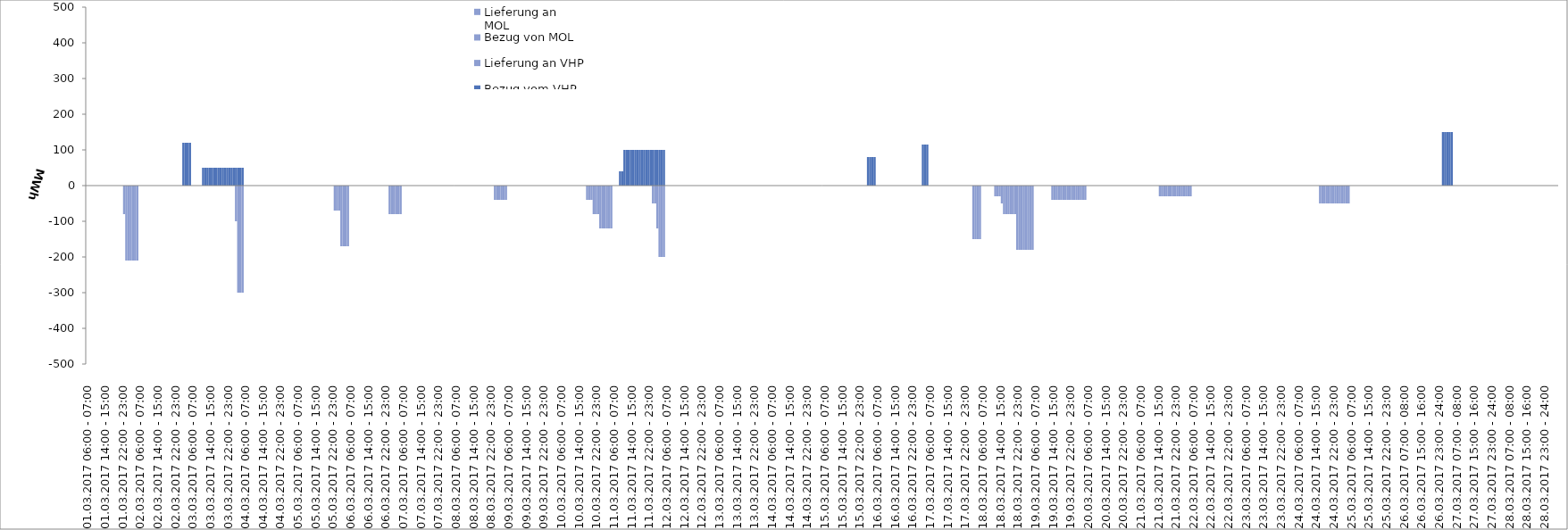
| Category | Bezug vom VHP | Lieferung an VHP | Bezug von MOL | Lieferung an MOL |
|---|---|---|---|---|
| 01.03.2017 06:00 - 07:00 | 0 | 0 | 0 | 0 |
| 01.03.2017 07:00 - 08:00 | 0 | 0 | 0 | 0 |
| 01.03.2017 08:00 - 09:00 | 0 | 0 | 0 | 0 |
| 01.03.2017 09:00 - 10:00 | 0 | 0 | 0 | 0 |
| 01.03.2017 10:00 - 11:00 | 0 | 0 | 0 | 0 |
| 01.03.2017 11:00 - 12:00 | 0 | 0 | 0 | 0 |
| 01.03.2017 12:00 - 13:00 | 0 | 0 | 0 | 0 |
| 01.03.2017 13:00 - 14:00 | 0 | 0 | 0 | 0 |
| 01.03.2017 14:00 - 15:00 | 0 | 0 | 0 | 0 |
| 01.03.2017 15:00 - 16:00 | 0 | 0 | 0 | 0 |
| 01.03.2017 16:00 - 17:00 | 0 | 0 | 0 | 0 |
| 01.03.2017 17:00 - 18:00 | 0 | 0 | 0 | 0 |
| 01.03.2017 18:00 - 19:00 | 0 | 0 | 0 | 0 |
| 01.03.2017 19:00 - 20:00 | 0 | 0 | 0 | 0 |
| 01.03.2017 20:00 - 21:00 | 0 | 0 | 0 | 0 |
| 01.03.2017 21:00 - 22:00 | 0 | 0 | 0 | 0 |
| 01.03.2017 22:00 - 23:00 | 0 | 0 | 0 | 0 |
| 01.03.2017 23:00 - 24:00 | 0 | -80 | 0 | 0 |
| 02.03.2017 00:00 - 01:00 | 0 | -210 | 0 | 0 |
| 02.03.2017 01:00 - 02:00 | 0 | -210 | 0 | 0 |
| 02.03.2017 02:00 - 03:00 | 0 | -210 | 0 | 0 |
| 02.03.2017 03:00 - 04:00 | 0 | -210 | 0 | 0 |
| 02.03.2017 04:00 - 05:00 | 0 | -210 | 0 | 0 |
| 02.03.2017 05:00 - 06:00 | 0 | -210 | 0 | 0 |
| 02.03.2017 06:00 - 07:00 | 0 | 0 | 0 | 0 |
| 02.03.2017 07:00 - 08:00 | 0 | 0 | 0 | 0 |
| 02.03.2017 08:00 - 09:00 | 0 | 0 | 0 | 0 |
| 02.03.2017 09:00 - 10:00 | 0 | 0 | 0 | 0 |
| 02.03.2017 10:00 - 11:00 | 0 | 0 | 0 | 0 |
| 02.03.2017 11:00 - 12:00 | 0 | 0 | 0 | 0 |
| 02.03.2017 12:00 - 13:00 | 0 | 0 | 0 | 0 |
| 02.03.2017 13:00 - 14:00 | 0 | 0 | 0 | 0 |
| 02.03.2017 14:00 - 15:00 | 0 | 0 | 0 | 0 |
| 02.03.2017 15:00 - 16:00 | 0 | 0 | 0 | 0 |
| 02.03.2017 16:00 - 17:00 | 0 | 0 | 0 | 0 |
| 02.03.2017 17:00 - 18:00 | 0 | 0 | 0 | 0 |
| 02.03.2017 18:00 - 19:00 | 0 | 0 | 0 | 0 |
| 02.03.2017 19:00 - 20:00 | 0 | 0 | 0 | 0 |
| 02.03.2017 20:00 - 21:00 | 0 | 0 | 0 | 0 |
| 02.03.2017 21:00 - 22:00 | 0 | 0 | 0 | 0 |
| 02.03.2017 22:00 - 23:00 | 0 | 0 | 0 | 0 |
| 02.03.2017 23:00 - 24:00 | 0 | 0 | 0 | 0 |
| 03.03.2017 00:00 - 01:00 | 0 | 0 | 0 | 0 |
| 03.03.2017 01:00 - 02:00 | 0 | 0 | 0 | 0 |
| 03.03.2017 02:00 - 03:00 | 120 | 0 | 0 | 0 |
| 03.03.2017 03:00 - 04:00 | 120 | 0 | 0 | 0 |
| 03.03.2017 04:00 - 05:00 | 120 | 0 | 0 | 0 |
| 03.03.2017 05:00 - 06:00 | 120 | 0 | 0 | 0 |
| 03.03.2017 06:00 - 07:00 | 0 | 0 | 0 | 0 |
| 03.03.2017 07:00 - 08:00 | 0 | 0 | 0 | 0 |
| 03.03.2017 08:00 - 09:00 | 0 | 0 | 0 | 0 |
| 03.03.2017 09:00 - 10:00 | 0 | 0 | 0 | 0 |
| 03.03.2017 10:00 - 11:00 | 0 | 0 | 0 | 0 |
| 03.03.2017 11:00 - 12:00 | 50 | 0 | 0 | 0 |
| 03.03.2017 12:00 - 13:00 | 50 | 0 | 0 | 0 |
| 03.03.2017 13:00 - 14:00 | 50 | 0 | 0 | 0 |
| 03.03.2017 14:00 - 15:00 | 50 | 0 | 0 | 0 |
| 03.03.2017 15:00 - 16:00 | 50 | 0 | 0 | 0 |
| 03.03.2017 16:00 - 17:00 | 50 | 0 | 0 | 0 |
| 03.03.2017 17:00 - 18:00 | 50 | 0 | 0 | 0 |
| 03.03.2017 18:00 - 19:00 | 50 | 0 | 0 | 0 |
| 03.03.2017 19:00 - 20:00 | 50 | 0 | 0 | 0 |
| 03.03.2017 20:00 - 21:00 | 50 | 0 | 0 | 0 |
| 03.03.2017 21:00 - 22:00 | 50 | 0 | 0 | 0 |
| 03.03.2017 22:00 - 23:00 | 50 | 0 | 0 | 0 |
| 03.03.2017 23:00 - 24:00 | 50 | 0 | 0 | 0 |
| 04.03.2017 00:00 - 01:00 | 50 | 0 | 0 | 0 |
| 04.03.2017 01:00 - 02:00 | 50 | 0 | 0 | 0 |
| 04.03.2017 02:00 - 03:00 | 50 | -100 | 0 | 0 |
| 04.03.2017 03:00 - 04:00 | 50 | -300 | 0 | 0 |
| 04.03.2017 04:00 - 05:00 | 50 | -300 | 0 | 0 |
| 04.03.2017 05:00 - 06:00 | 50 | -300 | 0 | 0 |
| 04.03.2017 06:00 - 07:00 | 0 | 0 | 0 | 0 |
| 04.03.2017 07:00 - 08:00 | 0 | 0 | 0 | 0 |
| 04.03.2017 08:00 - 09:00 | 0 | 0 | 0 | 0 |
| 04.03.2017 09:00 - 10:00 | 0 | 0 | 0 | 0 |
| 04.03.2017 10:00 - 11:00 | 0 | 0 | 0 | 0 |
| 04.03.2017 11:00 - 12:00 | 0 | 0 | 0 | 0 |
| 04.03.2017 12:00 - 13:00 | 0 | 0 | 0 | 0 |
| 04.03.2017 13:00 - 14:00 | 0 | 0 | 0 | 0 |
| 04.03.2017 14:00 - 15:00 | 0 | 0 | 0 | 0 |
| 04.03.2017 15:00 - 16:00 | 0 | 0 | 0 | 0 |
| 04.03.2017 16:00 - 17:00 | 0 | 0 | 0 | 0 |
| 04.03.2017 17:00 - 18:00 | 0 | 0 | 0 | 0 |
| 04.03.2017 18:00 - 19:00 | 0 | 0 | 0 | 0 |
| 04.03.2017 19:00 - 20:00 | 0 | 0 | 0 | 0 |
| 04.03.2017 20:00 - 21:00 | 0 | 0 | 0 | 0 |
| 04.03.2017 21:00 - 22:00 | 0 | 0 | 0 | 0 |
| 04.03.2017 22:00 - 23:00 | 0 | 0 | 0 | 0 |
| 04.03.2017 23:00 - 24:00 | 0 | 0 | 0 | 0 |
| 05.03.2017 00:00 - 01:00 | 0 | 0 | 0 | 0 |
| 05.03.2017 01:00 - 02:00 | 0 | 0 | 0 | 0 |
| 05.03.2017 02:00 - 03:00 | 0 | 0 | 0 | 0 |
| 05.03.2017 03:00 - 04:00 | 0 | 0 | 0 | 0 |
| 05.03.2017 04:00 - 05:00 | 0 | 0 | 0 | 0 |
| 05.03.2017 05:00 - 06:00 | 0 | 0 | 0 | 0 |
| 05.03.2017 06:00 - 07:00 | 0 | 0 | 0 | 0 |
| 05.03.2017 07:00 - 08:00 | 0 | 0 | 0 | 0 |
| 05.03.2017 08:00 - 09:00 | 0 | 0 | 0 | 0 |
| 05.03.2017 09:00 - 10:00 | 0 | 0 | 0 | 0 |
| 05.03.2017 10:00 - 11:00 | 0 | 0 | 0 | 0 |
| 05.03.2017 11:00 - 12:00 | 0 | 0 | 0 | 0 |
| 05.03.2017 12:00 - 13:00 | 0 | 0 | 0 | 0 |
| 05.03.2017 13:00 - 14:00 | 0 | 0 | 0 | 0 |
| 05.03.2017 14:00 - 15:00 | 0 | 0 | 0 | 0 |
| 05.03.2017 15:00 - 16:00 | 0 | 0 | 0 | 0 |
| 05.03.2017 16:00 - 17:00 | 0 | 0 | 0 | 0 |
| 05.03.2017 17:00 - 18:00 | 0 | 0 | 0 | 0 |
| 05.03.2017 18:00 - 19:00 | 0 | 0 | 0 | 0 |
| 05.03.2017 19:00 - 20:00 | 0 | 0 | 0 | 0 |
| 05.03.2017 20:00 - 21:00 | 0 | 0 | 0 | 0 |
| 05.03.2017 21:00 - 22:00 | 0 | 0 | 0 | 0 |
| 05.03.2017 22:00 - 23:00 | 0 | 0 | 0 | 0 |
| 05.03.2017 23:00 - 24:00 | 0 | -70 | 0 | 0 |
| 06.03.2017 00:00 - 01:00 | 0 | -70 | 0 | 0 |
| 06.03.2017 01:00 - 02:00 | 0 | -70 | 0 | 0 |
| 06.03.2017 02:00 - 03:00 | 0 | -170 | 0 | 0 |
| 06.03.2017 03:00 - 04:00 | 0 | -170 | 0 | 0 |
| 06.03.2017 04:00 - 05:00 | 0 | -170 | 0 | 0 |
| 06.03.2017 05:00 - 06:00 | 0 | -170 | 0 | 0 |
| 06.03.2017 06:00 - 07:00 | 0 | 0 | 0 | 0 |
| 06.03.2017 07:00 - 08:00 | 0 | 0 | 0 | 0 |
| 06.03.2017 08:00 - 09:00 | 0 | 0 | 0 | 0 |
| 06.03.2017 09:00 - 10:00 | 0 | 0 | 0 | 0 |
| 06.03.2017 10:00 - 11:00 | 0 | 0 | 0 | 0 |
| 06.03.2017 11:00 - 12:00 | 0 | 0 | 0 | 0 |
| 06.03.2017 12:00 - 13:00 | 0 | 0 | 0 | 0 |
| 06.03.2017 13:00 - 14:00 | 0 | 0 | 0 | 0 |
| 06.03.2017 14:00 - 15:00 | 0 | 0 | 0 | 0 |
| 06.03.2017 15:00 - 16:00 | 0 | 0 | 0 | 0 |
| 06.03.2017 16:00 - 17:00 | 0 | 0 | 0 | 0 |
| 06.03.2017 17:00 - 18:00 | 0 | 0 | 0 | 0 |
| 06.03.2017 18:00 - 19:00 | 0 | 0 | 0 | 0 |
| 06.03.2017 19:00 - 20:00 | 0 | 0 | 0 | 0 |
| 06.03.2017 20:00 - 21:00 | 0 | 0 | 0 | 0 |
| 06.03.2017 21:00 - 22:00 | 0 | 0 | 0 | 0 |
| 06.03.2017 22:00 - 23:00 | 0 | 0 | 0 | 0 |
| 06.03.2017 23:00 - 24:00 | 0 | 0 | 0 | 0 |
| 07.03.2017 00:00 - 01:00 | 0 | -80 | 0 | 0 |
| 07.03.2017 01:00 - 02:00 | 0 | -80 | 0 | 0 |
| 07.03.2017 02:00 - 03:00 | 0 | -80 | 0 | 0 |
| 07.03.2017 03:00 - 04:00 | 0 | -80 | 0 | 0 |
| 07.03.2017 04:00 - 05:00 | 0 | -80 | 0 | 0 |
| 07.03.2017 05:00 - 06:00 | 0 | -80 | 0 | 0 |
| 07.03.2017 06:00 - 07:00 | 0 | 0 | 0 | 0 |
| 07.03.2017 07:00 - 08:00 | 0 | 0 | 0 | 0 |
| 07.03.2017 08:00 - 09:00 | 0 | 0 | 0 | 0 |
| 07.03.2017 09:00 - 10:00 | 0 | 0 | 0 | 0 |
| 07.03.2017 10:00 - 11:00 | 0 | 0 | 0 | 0 |
| 07.03.2017 11:00 - 12:00 | 0 | 0 | 0 | 0 |
| 07.03.2017 12:00 - 13:00 | 0 | 0 | 0 | 0 |
| 07.03.2017 13:00 - 14:00 | 0 | 0 | 0 | 0 |
| 07.03.2017 14:00 - 15:00 | 0 | 0 | 0 | 0 |
| 07.03.2017 15:00 - 16:00 | 0 | 0 | 0 | 0 |
| 07.03.2017 16:00 - 17:00 | 0 | 0 | 0 | 0 |
| 07.03.2017 17:00 - 18:00 | 0 | 0 | 0 | 0 |
| 07.03.2017 18:00 - 19:00 | 0 | 0 | 0 | 0 |
| 07.03.2017 19:00 - 20:00 | 0 | 0 | 0 | 0 |
| 07.03.2017 20:00 - 21:00 | 0 | 0 | 0 | 0 |
| 07.03.2017 21:00 - 22:00 | 0 | 0 | 0 | 0 |
| 07.03.2017 22:00 - 23:00 | 0 | 0 | 0 | 0 |
| 07.03.2017 23:00 - 24:00 | 0 | 0 | 0 | 0 |
| 08.03.2017 00:00 - 01:00 | 0 | 0 | 0 | 0 |
| 08.03.2017 01:00 - 02:00 | 0 | 0 | 0 | 0 |
| 08.03.2017 02:00 - 03:00 | 0 | 0 | 0 | 0 |
| 08.03.2017 03:00 - 04:00 | 0 | 0 | 0 | 0 |
| 08.03.2017 04:00 - 05:00 | 0 | 0 | 0 | 0 |
| 08.03.2017 05:00 - 06:00 | 0 | 0 | 0 | 0 |
| 08.03.2017 06:00 - 07:00 | 0 | 0 | 0 | 0 |
| 08.03.2017 07:00 - 08:00 | 0 | 0 | 0 | 0 |
| 08.03.2017 08:00 - 09:00 | 0 | 0 | 0 | 0 |
| 08.03.2017 09:00 - 10:00 | 0 | 0 | 0 | 0 |
| 08.03.2017 10:00 - 11:00 | 0 | 0 | 0 | 0 |
| 08.03.2017 11:00 - 12:00 | 0 | 0 | 0 | 0 |
| 08.03.2017 12:00 - 13:00 | 0 | 0 | 0 | 0 |
| 08.03.2017 13:00 - 14:00 | 0 | 0 | 0 | 0 |
| 08.03.2017 14:00 - 15:00 | 0 | 0 | 0 | 0 |
| 08.03.2017 15:00 - 16:00 | 0 | 0 | 0 | 0 |
| 08.03.2017 16:00 - 17:00 | 0 | 0 | 0 | 0 |
| 08.03.2017 17:00 - 18:00 | 0 | 0 | 0 | 0 |
| 08.03.2017 18:00 - 19:00 | 0 | 0 | 0 | 0 |
| 08.03.2017 19:00 - 20:00 | 0 | 0 | 0 | 0 |
| 08.03.2017 20:00 - 21:00 | 0 | 0 | 0 | 0 |
| 08.03.2017 21:00 - 22:00 | 0 | 0 | 0 | 0 |
| 08.03.2017 22:00 - 23:00 | 0 | 0 | 0 | 0 |
| 08.03.2017 23:00 - 24:00 | 0 | 0 | 0 | 0 |
| 09.03.2017 00:00 - 01:00 | 0 | -40 | 0 | 0 |
| 09.03.2017 01:00 - 02:00 | 0 | -40 | 0 | 0 |
| 09.03.2017 02:00 - 03:00 | 0 | -40 | 0 | 0 |
| 09.03.2017 03:00 - 04:00 | 0 | -40 | 0 | 0 |
| 09.03.2017 04:00 - 05:00 | 0 | -40 | 0 | 0 |
| 09.03.2017 05:00 - 06:00 | 0 | -40 | 0 | 0 |
| 09.03.2017 06:00 - 07:00 | 0 | 0 | 0 | 0 |
| 09.03.2017 07:00 - 08:00 | 0 | 0 | 0 | 0 |
| 09.03.2017 08:00 - 09:00 | 0 | 0 | 0 | 0 |
| 09.03.2017 09:00 - 10:00 | 0 | 0 | 0 | 0 |
| 09.03.2017 10:00 - 11:00 | 0 | 0 | 0 | 0 |
| 09.03.2017 11:00 - 12:00 | 0 | 0 | 0 | 0 |
| 09.03.2017 12:00 - 13:00 | 0 | 0 | 0 | 0 |
| 09.03.2017 13:00 - 14:00 | 0 | 0 | 0 | 0 |
| 09.03.2017 14:00 - 15:00 | 0 | 0 | 0 | 0 |
| 09.03.2017 15:00 - 16:00 | 0 | 0 | 0 | 0 |
| 09.03.2017 16:00 - 17:00 | 0 | 0 | 0 | 0 |
| 09.03.2017 17:00 - 18:00 | 0 | 0 | 0 | 0 |
| 09.03.2017 18:00 - 19:00 | 0 | 0 | 0 | 0 |
| 09.03.2017 19:00 - 20:00 | 0 | 0 | 0 | 0 |
| 09.03.2017 20:00 - 21:00 | 0 | 0 | 0 | 0 |
| 09.03.2017 21:00 - 22:00 | 0 | 0 | 0 | 0 |
| 09.03.2017 22:00 - 23:00 | 0 | 0 | 0 | 0 |
| 09.03.2017 23:00 - 24:00 | 0 | 0 | 0 | 0 |
| 10.03.2017 00:00 - 01:00 | 0 | 0 | 0 | 0 |
| 10.03.2017 01:00 - 02:00 | 0 | 0 | 0 | 0 |
| 10.03.2017 02:00 - 03:00 | 0 | 0 | 0 | 0 |
| 10.03.2017 03:00 - 04:00 | 0 | 0 | 0 | 0 |
| 10.03.2017 04:00 - 05:00 | 0 | 0 | 0 | 0 |
| 10.03.2017 05:00 - 06:00 | 0 | 0 | 0 | 0 |
| 10.03.2017 06:00 - 07:00 | 0 | 0 | 0 | 0 |
| 10.03.2017 07:00 - 08:00 | 0 | 0 | 0 | 0 |
| 10.03.2017 08:00 - 09:00 | 0 | 0 | 0 | 0 |
| 10.03.2017 09:00 - 10:00 | 0 | 0 | 0 | 0 |
| 10.03.2017 10:00 - 11:00 | 0 | 0 | 0 | 0 |
| 10.03.2017 11:00 - 12:00 | 0 | 0 | 0 | 0 |
| 10.03.2017 12:00 - 13:00 | 0 | 0 | 0 | 0 |
| 10.03.2017 13:00 - 14:00 | 0 | 0 | 0 | 0 |
| 10.03.2017 14:00 - 15:00 | 0 | 0 | 0 | 0 |
| 10.03.2017 15:00 - 16:00 | 0 | 0 | 0 | 0 |
| 10.03.2017 16:00 - 17:00 | 0 | 0 | 0 | 0 |
| 10.03.2017 17:00 - 18:00 | 0 | 0 | 0 | 0 |
| 10.03.2017 18:00 - 19:00 | 0 | -40 | 0 | 0 |
| 10.03.2017 19:00 - 20:00 | 0 | -40 | 0 | 0 |
| 10.03.2017 20:00 - 21:00 | 0 | -40 | 0 | 0 |
| 10.03.2017 21:00 - 22:00 | 0 | -80 | 0 | 0 |
| 10.03.2017 22:00 - 23:00 | 0 | -80 | 0 | 0 |
| 10.03.2017 23:00 - 24:00 | 0 | -80 | 0 | 0 |
| 11.03.2017 00:00 - 01:00 | 0 | -120 | 0 | 0 |
| 11.03.2017 01:00 - 02:00 | 0 | -120 | 0 | 0 |
| 11.03.2017 02:00 - 03:00 | 0 | -120 | 0 | 0 |
| 11.03.2017 03:00 - 04:00 | 0 | -120 | 0 | 0 |
| 11.03.2017 04:00 - 05:00 | 0 | -120 | 0 | 0 |
| 11.03.2017 05:00 - 06:00 | 0 | -120 | 0 | 0 |
| 11.03.2017 06:00 - 07:00 | 0 | 0 | 0 | 0 |
| 11.03.2017 07:00 - 08:00 | 0 | 0 | 0 | 0 |
| 11.03.2017 08:00 - 09:00 | 0 | 0 | 0 | 0 |
| 11.03.2017 09:00 - 10:00 | 40 | 0 | 0 | 0 |
| 11.03.2017 10:00 - 11:00 | 40 | 0 | 0 | 0 |
| 11.03.2017 11:00 - 12:00 | 100 | 0 | 0 | 0 |
| 11.03.2017 12:00 - 13:00 | 100 | 0 | 0 | 0 |
| 11.03.2017 13:00 - 14:00 | 100 | 0 | 0 | 0 |
| 11.03.2017 14:00 - 15:00 | 100 | 0 | 0 | 0 |
| 11.03.2017 15:00 - 16:00 | 100 | 0 | 0 | 0 |
| 11.03.2017 16:00 - 17:00 | 100 | 0 | 0 | 0 |
| 11.03.2017 17:00 - 18:00 | 100 | 0 | 0 | 0 |
| 11.03.2017 18:00 - 19:00 | 100 | 0 | 0 | 0 |
| 11.03.2017 19:00 - 20:00 | 100 | 0 | 0 | 0 |
| 11.03.2017 20:00 - 21:00 | 100 | 0 | 0 | 0 |
| 11.03.2017 21:00 - 22:00 | 100 | 0 | 0 | 0 |
| 11.03.2017 22:00 - 23:00 | 100 | 0 | 0 | 0 |
| 11.03.2017 23:00 - 24:00 | 100 | 0 | 0 | 0 |
| 12.03.2017 00:00 - 01:00 | 100 | -50 | 0 | 0 |
| 12.03.2017 01:00 - 02:00 | 100 | -50 | 0 | 0 |
| 12.03.2017 02:00 - 03:00 | 100 | -120 | 0 | 0 |
| 12.03.2017 03:00 - 04:00 | 100 | -200 | 0 | 0 |
| 12.03.2017 04:00 - 05:00 | 100 | -200 | 0 | 0 |
| 12.03.2017 05:00 - 06:00 | 100 | -200 | 0 | 0 |
| 12.03.2017 06:00 - 07:00 | 0 | 0 | 0 | 0 |
| 12.03.2017 07:00 - 08:00 | 0 | 0 | 0 | 0 |
| 12.03.2017 08:00 - 09:00 | 0 | 0 | 0 | 0 |
| 12.03.2017 09:00 - 10:00 | 0 | 0 | 0 | 0 |
| 12.03.2017 10:00 - 11:00 | 0 | 0 | 0 | 0 |
| 12.03.2017 11:00 - 12:00 | 0 | 0 | 0 | 0 |
| 12.03.2017 12:00 - 13:00 | 0 | 0 | 0 | 0 |
| 12.03.2017 13:00 - 14:00 | 0 | 0 | 0 | 0 |
| 12.03.2017 14:00 - 15:00 | 0 | 0 | 0 | 0 |
| 12.03.2017 15:00 - 16:00 | 0 | 0 | 0 | 0 |
| 12.03.2017 16:00 - 17:00 | 0 | 0 | 0 | 0 |
| 12.03.2017 17:00 - 18:00 | 0 | 0 | 0 | 0 |
| 12.03.2017 18:00 - 19:00 | 0 | 0 | 0 | 0 |
| 12.03.2017 19:00 - 20:00 | 0 | 0 | 0 | 0 |
| 12.03.2017 20:00 - 21:00 | 0 | 0 | 0 | 0 |
| 12.03.2017 21:00 - 22:00 | 0 | 0 | 0 | 0 |
| 12.03.2017 22:00 - 23:00 | 0 | 0 | 0 | 0 |
| 12.03.2017 23:00 - 24:00 | 0 | 0 | 0 | 0 |
| 13.03.2017 00:00 - 01:00 | 0 | 0 | 0 | 0 |
| 13.03.2017 01:00 - 02:00 | 0 | 0 | 0 | 0 |
| 13.03.2017 02:00 - 03:00 | 0 | 0 | 0 | 0 |
| 13.03.2017 03:00 - 04:00 | 0 | 0 | 0 | 0 |
| 13.03.2017 04:00 - 05:00 | 0 | 0 | 0 | 0 |
| 13.03.2017 05:00 - 06:00 | 0 | 0 | 0 | 0 |
| 13.03.2017 06:00 - 07:00 | 0 | 0 | 0 | 0 |
| 13.03.2017 07:00 - 08:00 | 0 | 0 | 0 | 0 |
| 13.03.2017 08:00 - 09:00 | 0 | 0 | 0 | 0 |
| 13.03.2017 09:00 - 10:00 | 0 | 0 | 0 | 0 |
| 13.03.2017 10:00 - 11:00 | 0 | 0 | 0 | 0 |
| 13.03.2017 11:00 - 12:00 | 0 | 0 | 0 | 0 |
| 13.03.2017 12:00 - 13:00 | 0 | 0 | 0 | 0 |
| 13.03.2017 13:00 - 14:00 | 0 | 0 | 0 | 0 |
| 13.03.2017 14:00 - 15:00 | 0 | 0 | 0 | 0 |
| 13.03.2017 15:00 - 16:00 | 0 | 0 | 0 | 0 |
| 13.03.2017 16:00 - 17:00 | 0 | 0 | 0 | 0 |
| 13.03.2017 17:00 - 18:00 | 0 | 0 | 0 | 0 |
| 13.03.2017 18:00 - 19:00 | 0 | 0 | 0 | 0 |
| 13.03.2017 19:00 - 20:00 | 0 | 0 | 0 | 0 |
| 13.03.2017 20:00 - 21:00 | 0 | 0 | 0 | 0 |
| 13.03.2017 21:00 - 22:00 | 0 | 0 | 0 | 0 |
| 13.03.2017 22:00 - 23:00 | 0 | 0 | 0 | 0 |
| 13.03.2017 23:00 - 24:00 | 0 | 0 | 0 | 0 |
| 14.03.2017 00:00 - 01:00 | 0 | 0 | 0 | 0 |
| 14.03.2017 01:00 - 02:00 | 0 | 0 | 0 | 0 |
| 14.03.2017 02:00 - 03:00 | 0 | 0 | 0 | 0 |
| 14.03.2017 03:00 - 04:00 | 0 | 0 | 0 | 0 |
| 14.03.2017 04:00 - 05:00 | 0 | 0 | 0 | 0 |
| 14.03.2017 05:00 - 06:00 | 0 | 0 | 0 | 0 |
| 14.03.2017 06:00 - 07:00 | 0 | 0 | 0 | 0 |
| 14.03.2017 07:00 - 08:00 | 0 | 0 | 0 | 0 |
| 14.03.2017 08:00 - 09:00 | 0 | 0 | 0 | 0 |
| 14.03.2017 09:00 - 10:00 | 0 | 0 | 0 | 0 |
| 14.03.2017 10:00 - 11:00 | 0 | 0 | 0 | 0 |
| 14.03.2017 11:00 - 12:00 | 0 | 0 | 0 | 0 |
| 14.03.2017 12:00 - 13:00 | 0 | 0 | 0 | 0 |
| 14.03.2017 13:00 - 14:00 | 0 | 0 | 0 | 0 |
| 14.03.2017 14:00 - 15:00 | 0 | 0 | 0 | 0 |
| 14.03.2017 15:00 - 16:00 | 0 | 0 | 0 | 0 |
| 14.03.2017 16:00 - 17:00 | 0 | 0 | 0 | 0 |
| 14.03.2017 17:00 - 18:00 | 0 | 0 | 0 | 0 |
| 14.03.2017 18:00 - 19:00 | 0 | 0 | 0 | 0 |
| 14.03.2017 19:00 - 20:00 | 0 | 0 | 0 | 0 |
| 14.03.2017 20:00 - 21:00 | 0 | 0 | 0 | 0 |
| 14.03.2017 21:00 - 22:00 | 0 | 0 | 0 | 0 |
| 14.03.2017 22:00 - 23:00 | 0 | 0 | 0 | 0 |
| 14.03.2017 23:00 - 24:00 | 0 | 0 | 0 | 0 |
| 15.03.2017 00:00 - 01:00 | 0 | 0 | 0 | 0 |
| 15.03.2017 01:00 - 02:00 | 0 | 0 | 0 | 0 |
| 15.03.2017 02:00 - 03:00 | 0 | 0 | 0 | 0 |
| 15.03.2017 03:00 - 04:00 | 0 | 0 | 0 | 0 |
| 15.03.2017 04:00 - 05:00 | 0 | 0 | 0 | 0 |
| 15.03.2017 05:00 - 06:00 | 0 | 0 | 0 | 0 |
| 15.03.2017 06:00 - 07:00 | 0 | 0 | 0 | 0 |
| 15.03.2017 07:00 - 08:00 | 0 | 0 | 0 | 0 |
| 15.03.2017 08:00 - 09:00 | 0 | 0 | 0 | 0 |
| 15.03.2017 09:00 - 10:00 | 0 | 0 | 0 | 0 |
| 15.03.2017 10:00 - 11:00 | 0 | 0 | 0 | 0 |
| 15.03.2017 11:00 - 12:00 | 0 | 0 | 0 | 0 |
| 15.03.2017 12:00 - 13:00 | 0 | 0 | 0 | 0 |
| 15.03.2017 13:00 - 14:00 | 0 | 0 | 0 | 0 |
| 15.03.2017 14:00 - 15:00 | 0 | 0 | 0 | 0 |
| 15.03.2017 15:00 - 16:00 | 0 | 0 | 0 | 0 |
| 15.03.2017 16:00 - 17:00 | 0 | 0 | 0 | 0 |
| 15.03.2017 17:00 - 18:00 | 0 | 0 | 0 | 0 |
| 15.03.2017 18:00 - 19:00 | 0 | 0 | 0 | 0 |
| 15.03.2017 19:00 - 20:00 | 0 | 0 | 0 | 0 |
| 15.03.2017 20:00 - 21:00 | 0 | 0 | 0 | 0 |
| 15.03.2017 21:00 - 22:00 | 0 | 0 | 0 | 0 |
| 15.03.2017 22:00 - 23:00 | 0 | 0 | 0 | 0 |
| 15.03.2017 23:00 - 24:00 | 0 | 0 | 0 | 0 |
| 16.03.2017 00:00 - 01:00 | 0 | 0 | 0 | 0 |
| 16.03.2017 01:00 - 02:00 | 0 | 0 | 0 | 0 |
| 16.03.2017 02:00 - 03:00 | 80 | 0 | 0 | 0 |
| 16.03.2017 03:00 - 04:00 | 80 | 0 | 0 | 0 |
| 16.03.2017 04:00 - 05:00 | 80 | 0 | 0 | 0 |
| 16.03.2017 05:00 - 06:00 | 80 | 0 | 0 | 0 |
| 16.03.2017 06:00 - 07:00 | 0 | 0 | 0 | 0 |
| 16.03.2017 07:00 - 08:00 | 0 | 0 | 0 | 0 |
| 16.03.2017 08:00 - 09:00 | 0 | 0 | 0 | 0 |
| 16.03.2017 09:00 - 10:00 | 0 | 0 | 0 | 0 |
| 16.03.2017 10:00 - 11:00 | 0 | 0 | 0 | 0 |
| 16.03.2017 11:00 - 12:00 | 0 | 0 | 0 | 0 |
| 16.03.2017 12:00 - 13:00 | 0 | 0 | 0 | 0 |
| 16.03.2017 13:00 - 14:00 | 0 | 0 | 0 | 0 |
| 16.03.2017 14:00 - 15:00 | 0 | 0 | 0 | 0 |
| 16.03.2017 15:00 - 16:00 | 0 | 0 | 0 | 0 |
| 16.03.2017 16:00 - 17:00 | 0 | 0 | 0 | 0 |
| 16.03.2017 17:00 - 18:00 | 0 | 0 | 0 | 0 |
| 16.03.2017 18:00 - 19:00 | 0 | 0 | 0 | 0 |
| 16.03.2017 19:00 - 20:00 | 0 | 0 | 0 | 0 |
| 16.03.2017 20:00 - 21:00 | 0 | 0 | 0 | 0 |
| 16.03.2017 21:00 - 22:00 | 0 | 0 | 0 | 0 |
| 16.03.2017 22:00 - 23:00 | 0 | 0 | 0 | 0 |
| 16.03.2017 23:00 - 24:00 | 0 | 0 | 0 | 0 |
| 17.03.2017 00:00 - 01:00 | 0 | 0 | 0 | 0 |
| 17.03.2017 01:00 - 02:00 | 0 | 0 | 0 | 0 |
| 17.03.2017 02:00 - 03:00 | 0 | 0 | 0 | 0 |
| 17.03.2017 03:00 - 04:00 | 115 | 0 | 0 | 0 |
| 17.03.2017 04:00 - 05:00 | 115 | 0 | 0 | 0 |
| 17.03.2017 05:00 - 06:00 | 115 | 0 | 0 | 0 |
| 17.03.2017 06:00 - 07:00 | 0 | 0 | 0 | 0 |
| 17.03.2017 07:00 - 08:00 | 0 | 0 | 0 | 0 |
| 17.03.2017 08:00 - 09:00 | 0 | 0 | 0 | 0 |
| 17.03.2017 09:00 - 10:00 | 0 | 0 | 0 | 0 |
| 17.03.2017 10:00 - 11:00 | 0 | 0 | 0 | 0 |
| 17.03.2017 11:00 - 12:00 | 0 | 0 | 0 | 0 |
| 17.03.2017 12:00 - 13:00 | 0 | 0 | 0 | 0 |
| 17.03.2017 13:00 - 14:00 | 0 | 0 | 0 | 0 |
| 17.03.2017 14:00 - 15:00 | 0 | 0 | 0 | 0 |
| 17.03.2017 15:00 - 16:00 | 0 | 0 | 0 | 0 |
| 17.03.2017 16:00 - 17:00 | 0 | 0 | 0 | 0 |
| 17.03.2017 17:00 - 18:00 | 0 | 0 | 0 | 0 |
| 17.03.2017 18:00 - 19:00 | 0 | 0 | 0 | 0 |
| 17.03.2017 19:00 - 20:00 | 0 | 0 | 0 | 0 |
| 17.03.2017 20:00 - 21:00 | 0 | 0 | 0 | 0 |
| 17.03.2017 21:00 - 22:00 | 0 | 0 | 0 | 0 |
| 17.03.2017 22:00 - 23:00 | 0 | 0 | 0 | 0 |
| 17.03.2017 23:00 - 24:00 | 0 | 0 | 0 | 0 |
| 18.03.2017 00:00 - 01:00 | 0 | 0 | 0 | 0 |
| 18.03.2017 01:00 - 02:00 | 0 | 0 | 0 | 0 |
| 18.03.2017 02:00 - 03:00 | 0 | -150 | 0 | 0 |
| 18.03.2017 03:00 - 04:00 | 0 | -150 | 0 | 0 |
| 18.03.2017 04:00 - 05:00 | 0 | -150 | 0 | 0 |
| 18.03.2017 05:00 - 06:00 | 0 | -150 | 0 | 0 |
| 18.03.2017 06:00 - 07:00 | 0 | 0 | 0 | 0 |
| 18.03.2017 07:00 - 08:00 | 0 | 0 | 0 | 0 |
| 18.03.2017 08:00 - 09:00 | 0 | 0 | 0 | 0 |
| 18.03.2017 09:00 - 10:00 | 0 | 0 | 0 | 0 |
| 18.03.2017 10:00 - 11:00 | 0 | 0 | 0 | 0 |
| 18.03.2017 11:00 - 12:00 | 0 | 0 | 0 | 0 |
| 18.03.2017 12:00 - 13:00 | 0 | -30 | 0 | 0 |
| 18.03.2017 13:00 - 14:00 | 0 | -30 | 0 | 0 |
| 18.03.2017 14:00 - 15:00 | 0 | -30 | 0 | 0 |
| 18.03.2017 15:00 - 16:00 | 0 | -50 | 0 | 0 |
| 18.03.2017 16:00 - 17:00 | 0 | -80 | 0 | 0 |
| 18.03.2017 17:00 - 18:00 | 0 | -80 | 0 | 0 |
| 18.03.2017 18:00 - 19:00 | 0 | -80 | 0 | 0 |
| 18.03.2017 19:00 - 20:00 | 0 | -80 | 0 | 0 |
| 18.03.2017 20:00 - 21:00 | 0 | -80 | 0 | 0 |
| 18.03.2017 21:00 - 22:00 | 0 | -80 | 0 | 0 |
| 18.03.2017 22:00 - 23:00 | 0 | -180 | 0 | 0 |
| 18.03.2017 23:00 - 24:00 | 0 | -180 | 0 | 0 |
| 19.03.2017 00:00 - 01:00 | 0 | -180 | 0 | 0 |
| 19.03.2017 01:00 - 02:00 | 0 | -180 | 0 | 0 |
| 19.03.2017 02:00 - 03:00 | 0 | -180 | 0 | 0 |
| 19.03.2017 03:00 - 04:00 | 0 | -180 | 0 | 0 |
| 19.03.2017 04:00 - 05:00 | 0 | -180 | 0 | 0 |
| 19.03.2017 05:00 - 06:00 | 0 | -180 | 0 | 0 |
| 19.03.2017 06:00 - 07:00 | 0 | 0 | 0 | 0 |
| 19.03.2017 07:00 - 08:00 | 0 | 0 | 0 | 0 |
| 19.03.2017 08:00 - 09:00 | 0 | 0 | 0 | 0 |
| 19.03.2017 09:00 - 10:00 | 0 | 0 | 0 | 0 |
| 19.03.2017 10:00 - 11:00 | 0 | 0 | 0 | 0 |
| 19.03.2017 11:00 - 12:00 | 0 | 0 | 0 | 0 |
| 19.03.2017 12:00 - 13:00 | 0 | 0 | 0 | 0 |
| 19.03.2017 13:00 - 14:00 | 0 | 0 | 0 | 0 |
| 19.03.2017 14:00 - 15:00 | 0 | -40 | 0 | 0 |
| 19.03.2017 15:00 - 16:00 | 0 | -40 | 0 | 0 |
| 19.03.2017 16:00 - 17:00 | 0 | -40 | 0 | 0 |
| 19.03.2017 17:00 - 18:00 | 0 | -40 | 0 | 0 |
| 19.03.2017 18:00 - 19:00 | 0 | -40 | 0 | 0 |
| 19.03.2017 19:00 - 20:00 | 0 | -40 | 0 | 0 |
| 19.03.2017 20:00 - 21:00 | 0 | -40 | 0 | 0 |
| 19.03.2017 21:00 - 22:00 | 0 | -40 | 0 | 0 |
| 19.03.2017 22:00 - 23:00 | 0 | -40 | 0 | 0 |
| 19.03.2017 23:00 - 24:00 | 0 | -40 | 0 | 0 |
| 20.03.2017 00:00 - 01:00 | 0 | -40 | 0 | 0 |
| 20.03.2017 01:00 - 02:00 | 0 | -40 | 0 | 0 |
| 20.03.2017 02:00 - 03:00 | 0 | -40 | 0 | 0 |
| 20.03.2017 03:00 - 04:00 | 0 | -40 | 0 | 0 |
| 20.03.2017 04:00 - 05:00 | 0 | -40 | 0 | 0 |
| 20.03.2017 05:00 - 06:00 | 0 | -40 | 0 | 0 |
| 20.03.2017 06:00 - 07:00 | 0 | 0 | 0 | 0 |
| 20.03.2017 07:00 - 08:00 | 0 | 0 | 0 | 0 |
| 20.03.2017 08:00 - 09:00 | 0 | 0 | 0 | 0 |
| 20.03.2017 09:00 - 10:00 | 0 | 0 | 0 | 0 |
| 20.03.2017 10:00 - 11:00 | 0 | 0 | 0 | 0 |
| 20.03.2017 11:00 - 12:00 | 0 | 0 | 0 | 0 |
| 20.03.2017 12:00 - 13:00 | 0 | 0 | 0 | 0 |
| 20.03.2017 13:00 - 14:00 | 0 | 0 | 0 | 0 |
| 20.03.2017 14:00 - 15:00 | 0 | 0 | 0 | 0 |
| 20.03.2017 15:00 - 16:00 | 0 | 0 | 0 | 0 |
| 20.03.2017 16:00 - 17:00 | 0 | 0 | 0 | 0 |
| 20.03.2017 17:00 - 18:00 | 0 | 0 | 0 | 0 |
| 20.03.2017 18:00 - 19:00 | 0 | 0 | 0 | 0 |
| 20.03.2017 19:00 - 20:00 | 0 | 0 | 0 | 0 |
| 20.03.2017 20:00 - 21:00 | 0 | 0 | 0 | 0 |
| 20.03.2017 21:00 - 22:00 | 0 | 0 | 0 | 0 |
| 20.03.2017 22:00 - 23:00 | 0 | 0 | 0 | 0 |
| 20.03.2017 23:00 - 24:00 | 0 | 0 | 0 | 0 |
| 21.03.2017 00:00 - 01:00 | 0 | 0 | 0 | 0 |
| 21.03.2017 01:00 - 02:00 | 0 | 0 | 0 | 0 |
| 21.03.2017 02:00 - 03:00 | 0 | 0 | 0 | 0 |
| 21.03.2017 03:00 - 04:00 | 0 | 0 | 0 | 0 |
| 21.03.2017 04:00 - 05:00 | 0 | 0 | 0 | 0 |
| 21.03.2017 05:00 - 06:00 | 0 | 0 | 0 | 0 |
| 21.03.2017 06:00 - 07:00 | 0 | 0 | 0 | 0 |
| 21.03.2017 07:00 - 08:00 | 0 | 0 | 0 | 0 |
| 21.03.2017 08:00 - 09:00 | 0 | 0 | 0 | 0 |
| 21.03.2017 09:00 - 10:00 | 0 | 0 | 0 | 0 |
| 21.03.2017 10:00 - 11:00 | 0 | 0 | 0 | 0 |
| 21.03.2017 11:00 - 12:00 | 0 | 0 | 0 | 0 |
| 21.03.2017 12:00 - 13:00 | 0 | 0 | 0 | 0 |
| 21.03.2017 13:00 - 14:00 | 0 | 0 | 0 | 0 |
| 21.03.2017 14:00 - 15:00 | 0 | 0 | 0 | 0 |
| 21.03.2017 15:00 - 16:00 | 0 | -30 | 0 | 0 |
| 21.03.2017 16:00 - 17:00 | 0 | -30 | 0 | 0 |
| 21.03.2017 17:00 - 18:00 | 0 | -30 | 0 | 0 |
| 21.03.2017 18:00 - 19:00 | 0 | -30 | 0 | 0 |
| 21.03.2017 19:00 - 20:00 | 0 | -30 | 0 | 0 |
| 21.03.2017 20:00 - 21:00 | 0 | -30 | 0 | 0 |
| 21.03.2017 21:00 - 22:00 | 0 | -30 | 0 | 0 |
| 21.03.2017 22:00 - 23:00 | 0 | -30 | 0 | 0 |
| 21.03.2017 23:00 - 24:00 | 0 | -30 | 0 | 0 |
| 22.03.2017 00:00 - 01:00 | 0 | -30 | 0 | 0 |
| 22.03.2017 01:00 - 02:00 | 0 | -30 | 0 | 0 |
| 22.03.2017 02:00 - 03:00 | 0 | -30 | 0 | 0 |
| 22.03.2017 03:00 - 04:00 | 0 | -30 | 0 | 0 |
| 22.03.2017 04:00 - 05:00 | 0 | -30 | 0 | 0 |
| 22.03.2017 05:00 - 06:00 | 0 | -30 | 0 | 0 |
| 22.03.2017 06:00 - 07:00 | 0 | 0 | 0 | 0 |
| 22.03.2017 07:00 - 08:00 | 0 | 0 | 0 | 0 |
| 22.03.2017 08:00 - 09:00 | 0 | 0 | 0 | 0 |
| 22.03.2017 09:00 - 10:00 | 0 | 0 | 0 | 0 |
| 22.03.2017 10:00 - 11:00 | 0 | 0 | 0 | 0 |
| 22.03.2017 11:00 - 12:00 | 0 | 0 | 0 | 0 |
| 22.03.2017 12:00 - 13:00 | 0 | 0 | 0 | 0 |
| 22.03.2017 13:00 - 14:00 | 0 | 0 | 0 | 0 |
| 22.03.2017 14:00 - 15:00 | 0 | 0 | 0 | 0 |
| 22.03.2017 15:00 - 16:00 | 0 | 0 | 0 | 0 |
| 22.03.2017 16:00 - 17:00 | 0 | 0 | 0 | 0 |
| 22.03.2017 17:00 - 18:00 | 0 | 0 | 0 | 0 |
| 22.03.2017 18:00 - 19:00 | 0 | 0 | 0 | 0 |
| 22.03.2017 19:00 - 20:00 | 0 | 0 | 0 | 0 |
| 22.03.2017 20:00 - 21:00 | 0 | 0 | 0 | 0 |
| 22.03.2017 21:00 - 22:00 | 0 | 0 | 0 | 0 |
| 22.03.2017 22:00 - 23:00 | 0 | 0 | 0 | 0 |
| 22.03.2017 23:00 - 24:00 | 0 | 0 | 0 | 0 |
| 23.03.2017 00:00 - 01:00 | 0 | 0 | 0 | 0 |
| 23.03.2017 01:00 - 02:00 | 0 | 0 | 0 | 0 |
| 23.03.2017 02:00 - 03:00 | 0 | 0 | 0 | 0 |
| 23.03.2017 03:00 - 04:00 | 0 | 0 | 0 | 0 |
| 23.03.2017 04:00 - 05:00 | 0 | 0 | 0 | 0 |
| 23.03.2017 05:00 - 06:00 | 0 | 0 | 0 | 0 |
| 23.03.2017 06:00 - 07:00 | 0 | 0 | 0 | 0 |
| 23.03.2017 07:00 - 08:00 | 0 | 0 | 0 | 0 |
| 23.03.2017 08:00 - 09:00 | 0 | 0 | 0 | 0 |
| 23.03.2017 09:00 - 10:00 | 0 | 0 | 0 | 0 |
| 23.03.2017 10:00 - 11:00 | 0 | 0 | 0 | 0 |
| 23.03.2017 11:00 - 12:00 | 0 | 0 | 0 | 0 |
| 23.03.2017 12:00 - 13:00 | 0 | 0 | 0 | 0 |
| 23.03.2017 13:00 - 14:00 | 0 | 0 | 0 | 0 |
| 23.03.2017 14:00 - 15:00 | 0 | 0 | 0 | 0 |
| 23.03.2017 15:00 - 16:00 | 0 | 0 | 0 | 0 |
| 23.03.2017 16:00 - 17:00 | 0 | 0 | 0 | 0 |
| 23.03.2017 17:00 - 18:00 | 0 | 0 | 0 | 0 |
| 23.03.2017 18:00 - 19:00 | 0 | 0 | 0 | 0 |
| 23.03.2017 19:00 - 20:00 | 0 | 0 | 0 | 0 |
| 23.03.2017 20:00 - 21:00 | 0 | 0 | 0 | 0 |
| 23.03.2017 21:00 - 22:00 | 0 | 0 | 0 | 0 |
| 23.03.2017 22:00 - 23:00 | 0 | 0 | 0 | 0 |
| 23.03.2017 23:00 - 24:00 | 0 | 0 | 0 | 0 |
| 24.03.2017 00:00 - 01:00 | 0 | 0 | 0 | 0 |
| 24.03.2017 01:00 - 02:00 | 0 | 0 | 0 | 0 |
| 24.03.2017 02:00 - 03:00 | 0 | 0 | 0 | 0 |
| 24.03.2017 03:00 - 04:00 | 0 | 0 | 0 | 0 |
| 24.03.2017 04:00 - 05:00 | 0 | 0 | 0 | 0 |
| 24.03.2017 05:00 - 06:00 | 0 | 0 | 0 | 0 |
| 24.03.2017 06:00 - 07:00 | 0 | 0 | 0 | 0 |
| 24.03.2017 07:00 - 08:00 | 0 | 0 | 0 | 0 |
| 24.03.2017 08:00 - 09:00 | 0 | 0 | 0 | 0 |
| 24.03.2017 09:00 - 10:00 | 0 | 0 | 0 | 0 |
| 24.03.2017 10:00 - 11:00 | 0 | 0 | 0 | 0 |
| 24.03.2017 11:00 - 12:00 | 0 | 0 | 0 | 0 |
| 24.03.2017 12:00 - 13:00 | 0 | 0 | 0 | 0 |
| 24.03.2017 13:00 - 14:00 | 0 | 0 | 0 | 0 |
| 24.03.2017 14:00 - 15:00 | 0 | 0 | 0 | 0 |
| 24.03.2017 15:00 - 16:00 | 0 | 0 | 0 | 0 |
| 24.03.2017 16:00 - 17:00 | 0 | -50 | 0 | 0 |
| 24.03.2017 17:00 - 18:00 | 0 | -50 | 0 | 0 |
| 24.03.2017 18:00 - 19:00 | 0 | -50 | 0 | 0 |
| 24.03.2017 19:00 - 20:00 | 0 | -50 | 0 | 0 |
| 24.03.2017 20:00 - 21:00 | 0 | -50 | 0 | 0 |
| 24.03.2017 21:00 - 22:00 | 0 | -50 | 0 | 0 |
| 24.03.2017 22:00 - 23:00 | 0 | -50 | 0 | 0 |
| 24.03.2017 23:00 - 24:00 | 0 | -50 | 0 | 0 |
| 25.03.2017 00:00 - 01:00 | 0 | -50 | 0 | 0 |
| 25.03.2017 01:00 - 02:00 | 0 | -50 | 0 | 0 |
| 25.03.2017 02:00 - 03:00 | 0 | -50 | 0 | 0 |
| 25.03.2017 03:00 - 04:00 | 0 | -50 | 0 | 0 |
| 25.03.2017 04:00 - 05:00 | 0 | -50 | 0 | 0 |
| 25.03.2017 05:00 - 06:00 | 0 | -50 | 0 | 0 |
| 25.03.2017 06:00 - 07:00 | 0 | 0 | 0 | 0 |
| 25.03.2017 07:00 - 08:00 | 0 | 0 | 0 | 0 |
| 25.03.2017 08:00 - 09:00 | 0 | 0 | 0 | 0 |
| 25.03.2017 09:00 - 10:00 | 0 | 0 | 0 | 0 |
| 25.03.2017 10:00 - 11:00 | 0 | 0 | 0 | 0 |
| 25.03.2017 11:00 - 12:00 | 0 | 0 | 0 | 0 |
| 25.03.2017 12:00 - 13:00 | 0 | 0 | 0 | 0 |
| 25.03.2017 13:00 - 14:00 | 0 | 0 | 0 | 0 |
| 25.03.2017 14:00 - 15:00 | 0 | 0 | 0 | 0 |
| 25.03.2017 15:00 - 16:00 | 0 | 0 | 0 | 0 |
| 25.03.2017 16:00 - 17:00 | 0 | 0 | 0 | 0 |
| 25.03.2017 17:00 - 18:00 | 0 | 0 | 0 | 0 |
| 25.03.2017 18:00 - 19:00 | 0 | 0 | 0 | 0 |
| 25.03.2017 19:00 - 20:00 | 0 | 0 | 0 | 0 |
| 25.03.2017 20:00 - 21:00 | 0 | 0 | 0 | 0 |
| 25.03.2017 21:00 - 22:00 | 0 | 0 | 0 | 0 |
| 25.03.2017 22:00 - 23:00 | 0 | 0 | 0 | 0 |
| 25.03.2017 23:00 - 24:00 | 0 | 0 | 0 | 0 |
| 26.03.2017 00:00 - 01:00 | 0 | 0 | 0 | 0 |
| 26.03.2017 01:00 - 02:00 | 0 | 0 | 0 | 0 |
| 26.03.2017 03:00 - 04:00 | 0 | 0 | 0 | 0 |
| 26.03.2017 04:00 - 05:00 | 0 | 0 | 0 | 0 |
| 26.03.2017 05:00 - 06:00 | 0 | 0 | 0 | 0 |
| 26.03.2017 06:00 - 07:00 | 0 | 0 | 0 | 0 |
| 26.03.2017 07:00 - 08:00 | 0 | 0 | 0 | 0 |
| 26.03.2017 08:00 - 09:00 | 0 | 0 | 0 | 0 |
| 26.03.2017 09:00 - 10:00 | 0 | 0 | 0 | 0 |
| 26.03.2017 10:00 - 11:00 | 0 | 0 | 0 | 0 |
| 26.03.2017 11:00 - 12:00 | 0 | 0 | 0 | 0 |
| 26.03.2017 12:00 - 13:00 | 0 | 0 | 0 | 0 |
| 26.03.2017 13:00 - 14:00 | 0 | 0 | 0 | 0 |
| 26.03.2017 14:00 - 15:00 | 0 | 0 | 0 | 0 |
| 26.03.2017 15:00 - 16:00 | 0 | 0 | 0 | 0 |
| 26.03.2017 16:00 - 17:00 | 0 | 0 | 0 | 0 |
| 26.03.2017 17:00 - 18:00 | 0 | 0 | 0 | 0 |
| 26.03.2017 18:00 - 19:00 | 0 | 0 | 0 | 0 |
| 26.03.2017 19:00 - 20:00 | 0 | 0 | 0 | 0 |
| 26.03.2017 20:00 - 21:00 | 0 | 0 | 0 | 0 |
| 26.03.2017 21:00 - 22:00 | 0 | 0 | 0 | 0 |
| 26.03.2017 22:00 - 23:00 | 0 | 0 | 0 | 0 |
| 26.03.2017 23:00 - 24:00 | 0 | 0 | 0 | 0 |
| 27.03.2017 00:00 - 01:00 | 0 | 0 | 0 | 0 |
| 27.03.2017 01:00 - 02:00 | 150 | 0 | 0 | 0 |
| 27.03.2017 02:00 - 03:00 | 150 | 0 | 0 | 0 |
| 27.03.2017 03:00 - 04:00 | 150 | 0 | 0 | 0 |
| 27.03.2017 04:00 - 05:00 | 150 | 0 | 0 | 0 |
| 27.03.2017 05:00 - 06:00 | 150 | 0 | 0 | 0 |
| 27.03.2017 06:00 - 07:00 | 0 | 0 | 0 | 0 |
| 27.03.2017 07:00 - 08:00 | 0 | 0 | 0 | 0 |
| 27.03.2017 08:00 - 09:00 | 0 | 0 | 0 | 0 |
| 27.03.2017 09:00 - 10:00 | 0 | 0 | 0 | 0 |
| 27.03.2017 10:00 - 11:00 | 0 | 0 | 0 | 0 |
| 27.03.2017 11:00 - 12:00 | 0 | 0 | 0 | 0 |
| 27.03.2017 12:00 - 13:00 | 0 | 0 | 0 | 0 |
| 27.03.2017 13:00 - 14:00 | 0 | 0 | 0 | 0 |
| 27.03.2017 14:00 - 15:00 | 0 | 0 | 0 | 0 |
| 27.03.2017 15:00 - 16:00 | 0 | 0 | 0 | 0 |
| 27.03.2017 16:00 - 17:00 | 0 | 0 | 0 | 0 |
| 27.03.2017 17:00 - 18:00 | 0 | 0 | 0 | 0 |
| 27.03.2017 18:00 - 19:00 | 0 | 0 | 0 | 0 |
| 27.03.2017 19:00 - 20:00 | 0 | 0 | 0 | 0 |
| 27.03.2017 20:00 - 21:00 | 0 | 0 | 0 | 0 |
| 27.03.2017 21:00 - 22:00 | 0 | 0 | 0 | 0 |
| 27.03.2017 22:00 - 23:00 | 0 | 0 | 0 | 0 |
| 27.03.2017 23:00 - 24:00 | 0 | 0 | 0 | 0 |
| 28.03.2017 00:00 - 01:00 | 0 | 0 | 0 | 0 |
| 28.03.2017 01:00 - 02:00 | 0 | 0 | 0 | 0 |
| 28.03.2017 02:00 - 03:00 | 0 | 0 | 0 | 0 |
| 28.03.2017 03:00 - 04:00 | 0 | 0 | 0 | 0 |
| 28.03.2017 04:00 - 05:00 | 0 | 0 | 0 | 0 |
| 28.03.2017 05:00 - 06:00 | 0 | 0 | 0 | 0 |
| 28.03.2017 06:00 - 07:00 | 0 | 0 | 0 | 0 |
| 28.03.2017 07:00 - 08:00 | 0 | 0 | 0 | 0 |
| 28.03.2017 08:00 - 09:00 | 0 | 0 | 0 | 0 |
| 28.03.2017 09:00 - 10:00 | 0 | 0 | 0 | 0 |
| 28.03.2017 10:00 - 11:00 | 0 | 0 | 0 | 0 |
| 28.03.2017 11:00 - 12:00 | 0 | 0 | 0 | 0 |
| 28.03.2017 12:00 - 13:00 | 0 | 0 | 0 | 0 |
| 28.03.2017 13:00 - 14:00 | 0 | 0 | 0 | 0 |
| 28.03.2017 14:00 - 15:00 | 0 | 0 | 0 | 0 |
| 28.03.2017 15:00 - 16:00 | 0 | 0 | 0 | 0 |
| 28.03.2017 16:00 - 17:00 | 0 | 0 | 0 | 0 |
| 28.03.2017 17:00 - 18:00 | 0 | 0 | 0 | 0 |
| 28.03.2017 18:00 - 19:00 | 0 | 0 | 0 | 0 |
| 28.03.2017 19:00 - 20:00 | 0 | 0 | 0 | 0 |
| 28.03.2017 20:00 - 21:00 | 0 | 0 | 0 | 0 |
| 28.03.2017 21:00 - 22:00 | 0 | 0 | 0 | 0 |
| 28.03.2017 22:00 - 23:00 | 0 | 0 | 0 | 0 |
| 28.03.2017 23:00 - 24:00 | 0 | 0 | 0 | 0 |
| 29.03.2017 00:00 -01:00 | 0 | 0 | 0 | 0 |
| 29.03.2017 01:00 -02:00 | 0 | 0 | 0 | 0 |
| 29.03.2017 02:00 - 03:00 | 0 | 0 | 0 | 0 |
| 29.03.2017 03:00 - 04:00 | 0 | 0 | 0 | 0 |
| 29.03.2017 04:00 - 05:00 | 0 | 0 | 0 | 0 |
| 29.03.2017 05:00 - 06:00 | 0 | 0 | 0 | 0 |